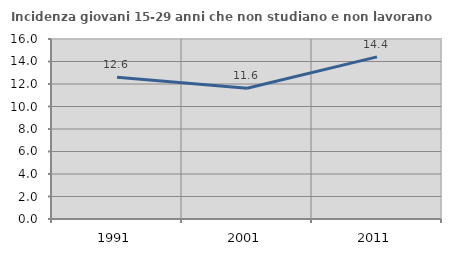
| Category | Incidenza giovani 15-29 anni che non studiano e non lavorano  |
|---|---|
| 1991.0 | 12.594 |
| 2001.0 | 11.615 |
| 2011.0 | 14.412 |